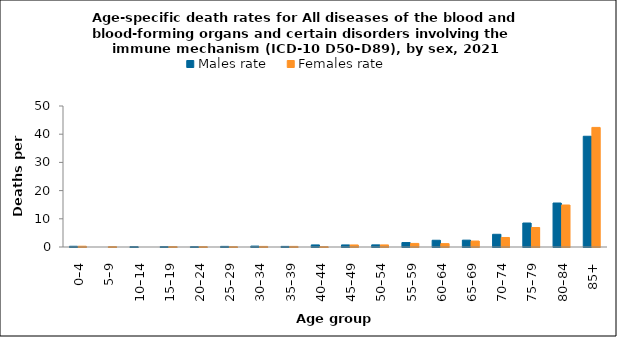
| Category | Males rate | Females rate |
|---|---|---|
| 0–4 | 0.258 | 0.273 |
| 5–9 | 0 | 0.127 |
| 10–14 | 0.12 | 0 |
| 15–19 | 0.131 | 0.139 |
| 20–24 | 0.119 | 0.127 |
| 25–29 | 0.218 | 0.111 |
| 30–34 | 0.319 | 0.209 |
| 35–39 | 0.215 | 0.213 |
| 40–44 | 0.735 | 0.119 |
| 45–49 | 0.734 | 0.721 |
| 50–54 | 0.756 | 0.734 |
| 55–59 | 1.574 | 1.269 |
| 60–64 | 2.39 | 1.194 |
| 65–69 | 2.429 | 2.113 |
| 70–74 | 4.507 | 3.378 |
| 75–79 | 8.509 | 6.915 |
| 80–84 | 15.602 | 14.893 |
| 85+ | 39.269 | 42.404 |